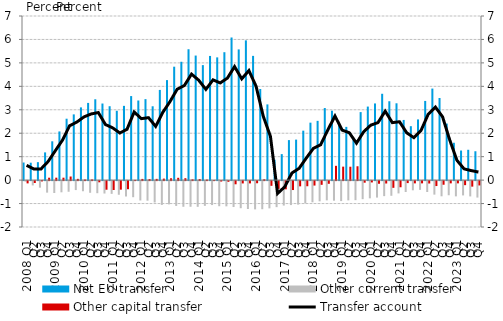
| Category | Net EU transfer | Other current transfer | Other capital transfer |
|---|---|---|---|
| 2008 Q1 | 0.75 | -0.024 | -0.097 |
| Q2 | 0.743 | -0.185 | -0.082 |
| Q3 | 0.766 | -0.279 | -0.013 |
| Q4 | 1.182 | -0.491 | 0.102 |
| 2009 Q1 | 1.655 | -0.507 | 0.104 |
| Q2 | 2.076 | -0.478 | 0.104 |
| Q3 | 2.619 | -0.453 | 0.154 |
| Q4 | 2.804 | -0.382 | 0.054 |
| 2010 Q1 | 3.102 | -0.432 | 0.026 |
| Q2 | 3.293 | -0.498 | 0.028 |
| Q3 | 3.448 | -0.516 | -0.051 |
| Q4 | 3.267 | -0.53 | -0.367 |
| 2011 Q1 | 3.152 | -0.544 | -0.379 |
| Q2 | 2.957 | -0.582 | -0.365 |
| Q3 | 3.167 | -0.656 | -0.346 |
| Q4 | 3.584 | -0.686 | 0.007 |
| 2012 Q1 | 3.396 | -0.826 | 0.051 |
| Q2 | 3.454 | -0.835 | 0.044 |
| Q3 | 3.15 | -0.912 | 0.053 |
| Q4 | 3.847 | -1.016 | 0.064 |
| 2013 Q1 | 4.266 | -0.992 | 0.078 |
| Q2 | 4.838 | -1.058 | 0.099 |
| Q3 | 5.048 | -1.095 | 0.081 |
| Q4 | 5.582 | -1.094 | 0.034 |
| 2014 Q1 | 5.313 | -1.097 | 0.044 |
| Q2 | 4.905 | -1.055 | 0.021 |
| Q3 | 5.297 | -1.022 | 0 |
| Q4 | 5.235 | -1.071 | -0.019 |
| 2015 Q1 | 5.456 | -1.076 | -0.029 |
| Q2 | 6.083 | -1.106 | -0.136 |
| Q3 | 5.575 | -1.156 | -0.099 |
| Q4 | 5.961 | -1.19 | -0.099 |
| 2016 Q1 | 5.299 | -1.206 | -0.092 |
| Q2 | 3.886 | -1.199 | 0.037 |
| Q3 | 3.229 | -1.162 | -0.201 |
| Q4 | 0.872 | -1.11 | -0.33 |
| 2017 Q1 | 1.108 | -1.043 | -0.35 |
| Q2 | 1.706 | -1.022 | -0.381 |
| Q3 | 1.727 | -1.002 | -0.223 |
| Q4 | 2.109 | -0.949 | -0.219 |
| 2018 Q1 | 2.451 | -0.903 | -0.19 |
| Q2 | 2.527 | -0.862 | -0.158 |
| Q3 | 3.074 | -0.821 | -0.114 |
| Q4 | 2.96 | -0.836 | 0.609 |
| 2019 Q1 | 2.411 | -0.852 | 0.575 |
| Q2 | 2.271 | -0.822 | 0.571 |
| Q3 | 1.798 | -0.813 | 0.591 |
| Q4 | 2.901 | -0.771 | -0.068 |
| 2020 Q1 | 3.136 | -0.734 | -0.056 |
| Q2 | 3.27 | -0.703 | -0.113 |
| Q3 | 3.683 | -0.641 | -0.102 |
| Q4 | 3.364 | -0.626 | -0.286 |
| 2021 Q1 | 3.277 | -0.525 | -0.262 |
| Q2 | 2.567 | -0.464 | -0.085 |
| Q3 | 2.301 | -0.392 | -0.096 |
| Q4 | 2.589 | -0.373 | -0.096 |
| 2022 Q1 | 3.377 | -0.465 | -0.103 |
| Q2 | 3.905 | -0.577 | -0.211 |
| Q3 | 3.503 | -0.647 | -0.155 |
| Q4 | 2.412 | -0.603 | -0.096 |
| 2023 Q1 | 1.593 | -0.65 | -0.096 |
| Q2 | 1.262 | -0.61 | -0.173 |
| Q3 | 1.294 | -0.653 | -0.236 |
| Q4 | 1.231 | -0.703 | -0.185 |